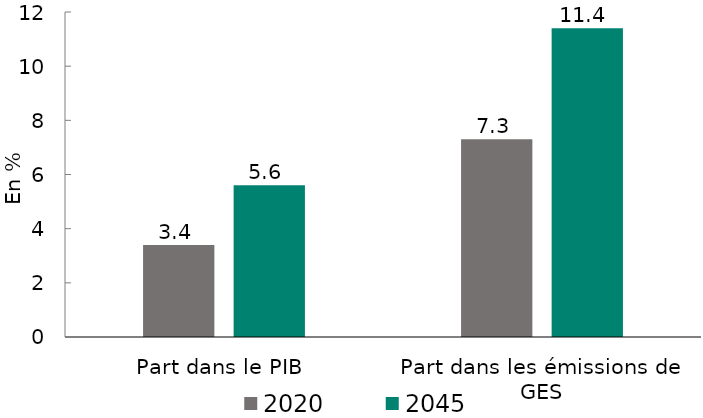
| Category | 2020 | 2045 |
|---|---|---|
| Part dans le PIB | 3.4 | 5.6 |
| Part dans les émissions de GES | 7.3 | 11.4 |